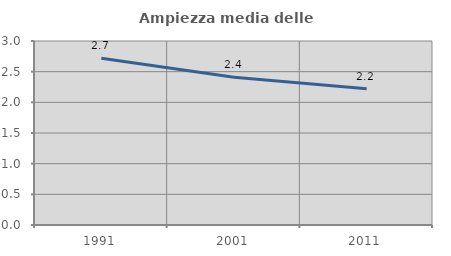
| Category | Ampiezza media delle famiglie |
|---|---|
| 1991.0 | 2.719 |
| 2001.0 | 2.409 |
| 2011.0 | 2.223 |